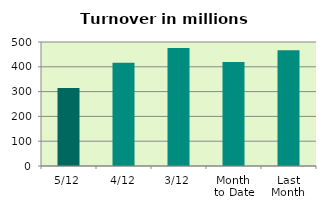
| Category | Series 0 |
|---|---|
| 5/12 | 314.384 |
| 4/12 | 416.615 |
| 3/12 | 475.558 |
| Month 
to Date | 419.384 |
| Last
Month | 466.544 |